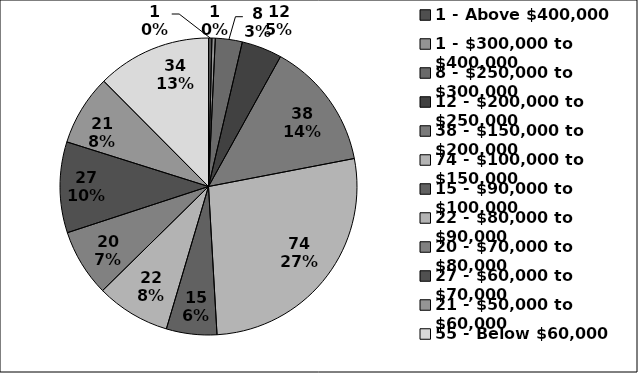
| Category | Series 0 |
|---|---|
| 1 - Above $400,000 | 1 |
| 1 - $300,000 to $400,000 | 1 |
| 8 - $250,000 to $300,000 | 8 |
| 12 - $200,000 to $250,000 | 12 |
| 38 - $150,000 to $200,000 | 38 |
| 74 - $100,000 to $150,000 | 74 |
| 15 - $90,000 to $100,000 | 15 |
| 22 - $80,000 to $90,000 | 22 |
| 20 - $70,000 to $80,000 | 20 |
| 27 - $60,000 to $70,000 | 27 |
| 21 - $50,000 to $60,000 | 21 |
| 55 - Below $60,000 | 34 |